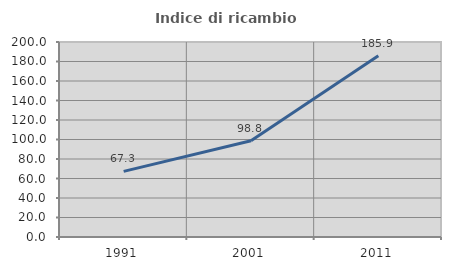
| Category | Indice di ricambio occupazionale  |
|---|---|
| 1991.0 | 67.275 |
| 2001.0 | 98.774 |
| 2011.0 | 185.908 |